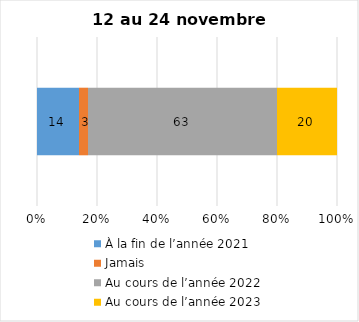
| Category | À la fin de l’année 2021 | Jamais | Au cours de l’année 2022 | Au cours de l’année 2023 |
|---|---|---|---|---|
| 0 | 14 | 3 | 63 | 20 |